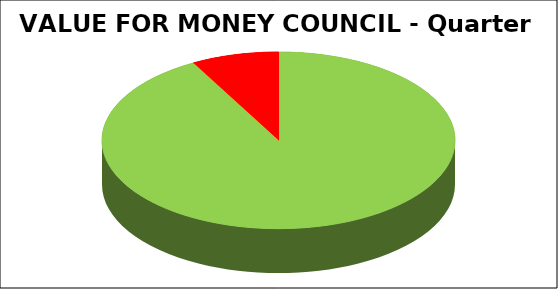
| Category | Series 0 |
|---|---|
| Green | 0.92 |
| Amber | 0 |
| Red | 0.08 |